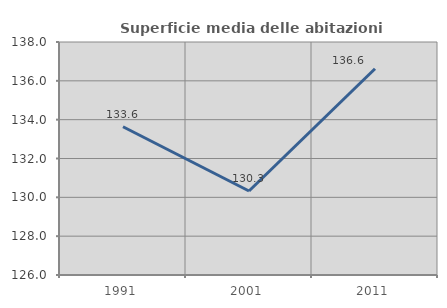
| Category | Superficie media delle abitazioni occupate |
|---|---|
| 1991.0 | 133.636 |
| 2001.0 | 130.327 |
| 2011.0 | 136.625 |